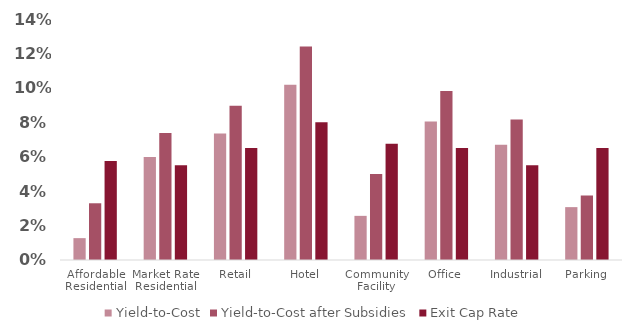
| Category | Yield-to-Cost | Yield-to-Cost after Subsidies | Exit Cap Rate |
|---|---|---|---|
| Affordable Residential | 0.013 | 0.033 | 0.058 |
| Market Rate Residential | 0.06 | 0.074 | 0.055 |
| Retail | 0.074 | 0.09 | 0.065 |
| Hotel | 0.102 | 0.124 | 0.08 |
| Community Facility | 0.026 | 0.05 | 0.068 |
| Office | 0.081 | 0.098 | 0.065 |
| Industrial | 0.067 | 0.082 | 0.055 |
| Parking | 0.031 | 0.037 | 0.065 |